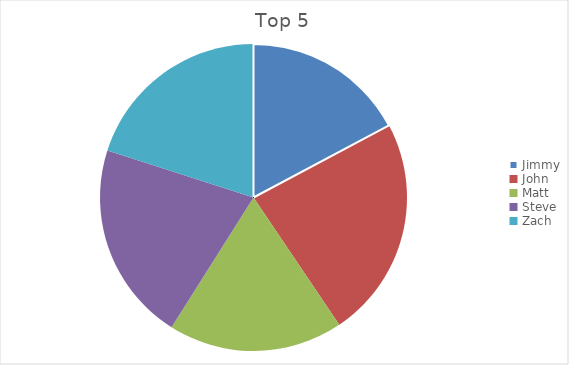
| Category | Total |
|---|---|
| Jimmy | 73 |
| John | 99 |
| Matt | 78 |
| Steve | 89 |
| Zach | 85 |